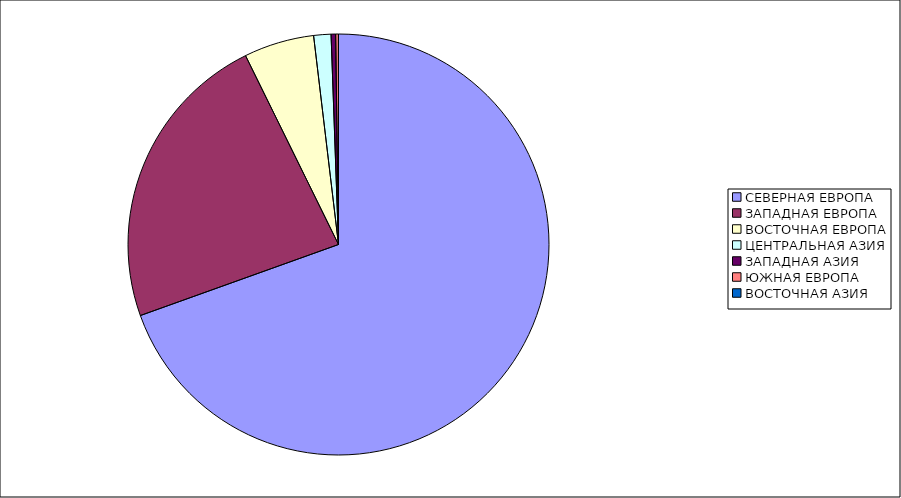
| Category | Оборот |
|---|---|
| СЕВЕРНАЯ ЕВРОПА | 69.52 |
| ЗАПАДНАЯ ЕВРОПА | 23.199 |
| ВОСТОЧНАЯ ЕВРОПА | 5.39 |
| ЦЕНТРАЛЬНАЯ АЗИЯ | 1.328 |
| ЗАПАДНАЯ АЗИЯ | 0.348 |
| ЮЖНАЯ ЕВРОПА | 0.209 |
| ВОСТОЧНАЯ АЗИЯ | 0.006 |